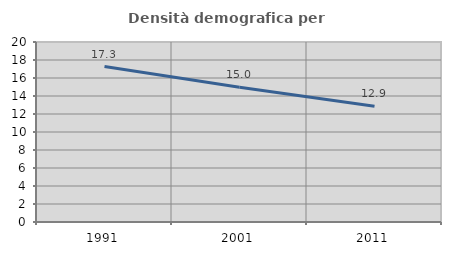
| Category | Densità demografica |
|---|---|
| 1991.0 | 17.277 |
| 2001.0 | 14.979 |
| 2011.0 | 12.873 |